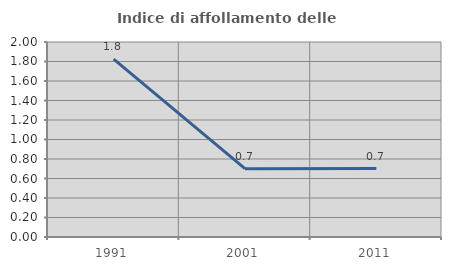
| Category | Indice di affollamento delle abitazioni  |
|---|---|
| 1991.0 | 1.824 |
| 2001.0 | 0.701 |
| 2011.0 | 0.702 |